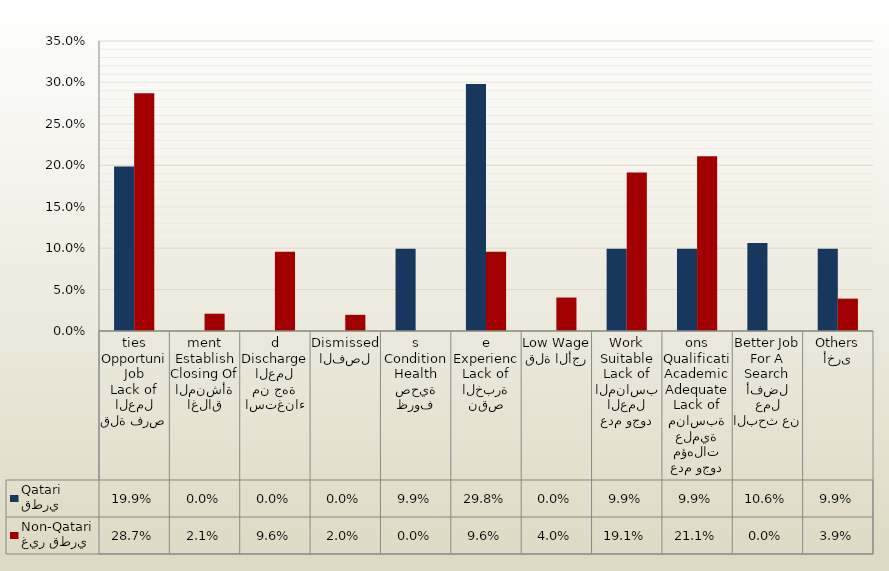
| Category | قطري
Qatari | غير قطري
Non-Qatari |
|---|---|---|
| قلة فرص العمل
Lack of Job Opportunities | 0.199 | 0.287 |
| اغلاق المنشأة
Closing Of Establishment | 0 | 0.021 |
| استغناء من جهة العمل
Discharged | 0 | 0.096 |
| الفصل
Dismissed | 0 | 0.02 |
| ظروف صحية
Health Conditions | 0.099 | 0 |
| نقص الخبرة
Lack of Experience | 0.298 | 0.096 |
| قلة الأجر
Low Wage | 0 | 0.04 |
| عدم وجود العمل المناسب
Lack of Suitable Work | 0.099 | 0.191 |
| عدم وجود مؤهلات علمية مناسبة
Lack of Adequate Academic Qualifications | 0.099 | 0.211 |
| البحث عن عمل أفضل
Search For A Better Job | 0.106 | 0 |
| أخرى
Others | 0.099 | 0.039 |